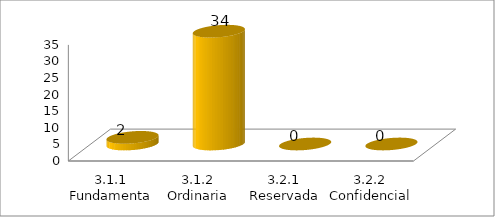
| Category | Series 0 |
|---|---|
| 3.1.1 Fundamental | 2 |
| 3.1.2 Ordinaria | 34 |
| 3.2.1 Reservada | 0 |
| 3.2.2 Confidencial | 0 |